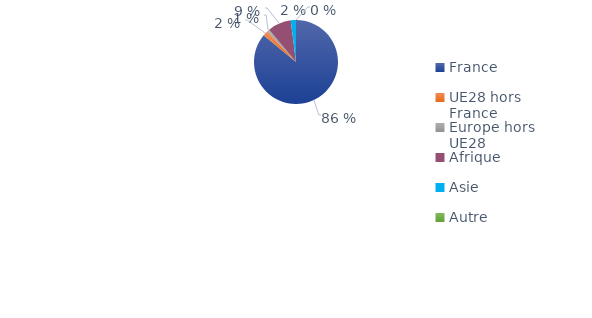
| Category | Series 0 |
|---|---|
| France | 0.86 |
| UE28 hors France | 0.02 |
| Europe hors UE28 | 0.01 |
| Afrique | 0.09 |
| Asie | 0.02 |
| Autre | 0 |